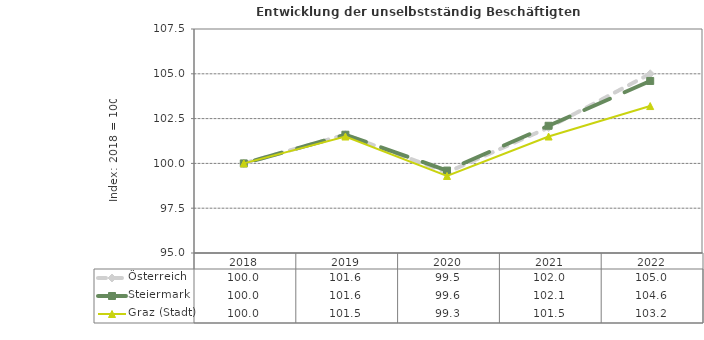
| Category | Österreich | Steiermark | Graz (Stadt) |
|---|---|---|---|
| 2022.0 | 105 | 104.6 | 103.2 |
| 2021.0 | 102 | 102.1 | 101.5 |
| 2020.0 | 99.5 | 99.6 | 99.3 |
| 2019.0 | 101.6 | 101.6 | 101.5 |
| 2018.0 | 100 | 100 | 100 |